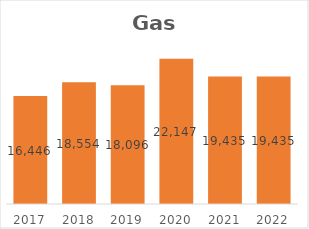
| Category | Series 0 |
|---|---|
| 2017.0 | 16446 |
| 2018.0 | 18554 |
| 2019.0 | 18096.33 |
| 2020.0 | 22147 |
| 2021.0 | 19435 |
| 2022.0 | 19435 |